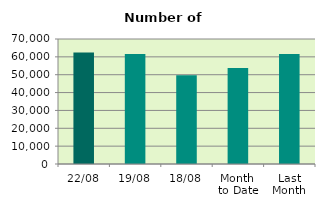
| Category | Series 0 |
|---|---|
| 22/08 | 62476 |
| 19/08 | 61576 |
| 18/08 | 49668 |
| Month 
to Date | 53733 |
| Last
Month | 61549.619 |